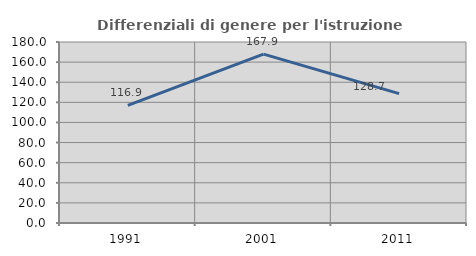
| Category | Differenziali di genere per l'istruzione superiore |
|---|---|
| 1991.0 | 116.898 |
| 2001.0 | 167.935 |
| 2011.0 | 128.679 |